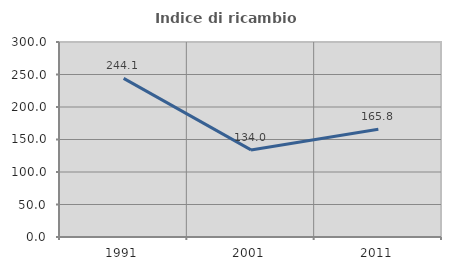
| Category | Indice di ricambio occupazionale  |
|---|---|
| 1991.0 | 244.118 |
| 2001.0 | 134 |
| 2011.0 | 165.789 |